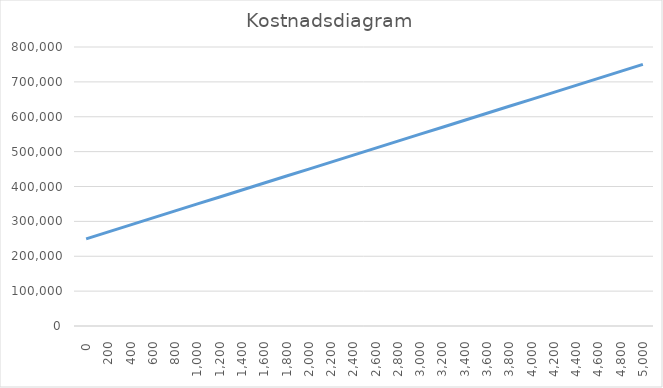
| Category | Totale kostnader |
|---|---|
| 0.0 | 250000 |
| 200.0 | 270000 |
| 400.0 | 290000 |
| 600.0 | 310000 |
| 800.0 | 330000 |
| 1000.0 | 350000 |
| 1200.0 | 370000 |
| 1400.0 | 390000 |
| 1600.0 | 410000 |
| 1800.0 | 430000 |
| 2000.0 | 450000 |
| 2200.0 | 470000 |
| 2400.0 | 490000 |
| 2600.0 | 510000 |
| 2800.0 | 530000 |
| 3000.0 | 550000 |
| 3200.0 | 570000 |
| 3400.0 | 590000 |
| 3600.0 | 610000 |
| 3800.0 | 630000 |
| 4000.0 | 650000 |
| 4200.0 | 670000 |
| 4400.0 | 690000 |
| 4600.0 | 710000 |
| 4800.0 | 730000 |
| 5000.0 | 750000 |